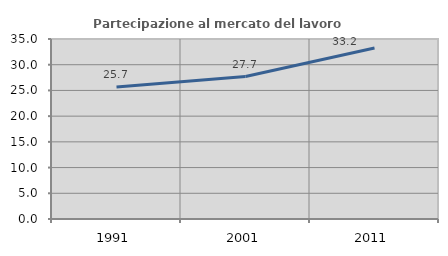
| Category | Partecipazione al mercato del lavoro  femminile |
|---|---|
| 1991.0 | 25.653 |
| 2001.0 | 27.704 |
| 2011.0 | 33.235 |